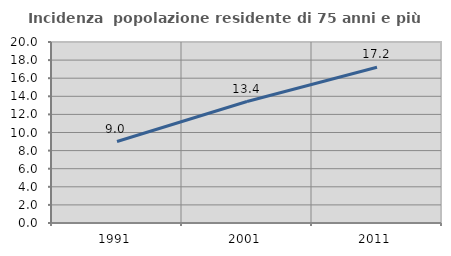
| Category | Incidenza  popolazione residente di 75 anni e più |
|---|---|
| 1991.0 | 9 |
| 2001.0 | 13.423 |
| 2011.0 | 17.21 |